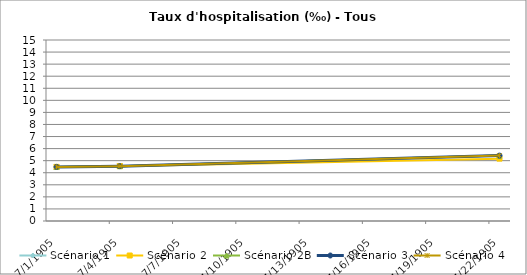
| Category | Scénario 1 | Scénario 2 | Scénario 2B | Scénario 3 | Scénario 4 |
|---|---|---|---|---|---|
| 2009.0 | 4.485 | 4.485 | 4.485 | 4.485 | 4.485 |
| 2012.0 | 4.547 | 4.547 | 4.547 | 4.547 | 4.547 |
| 2030.0 | 5.419 | 5.169 | 5.419 | 5.419 | 5.419 |